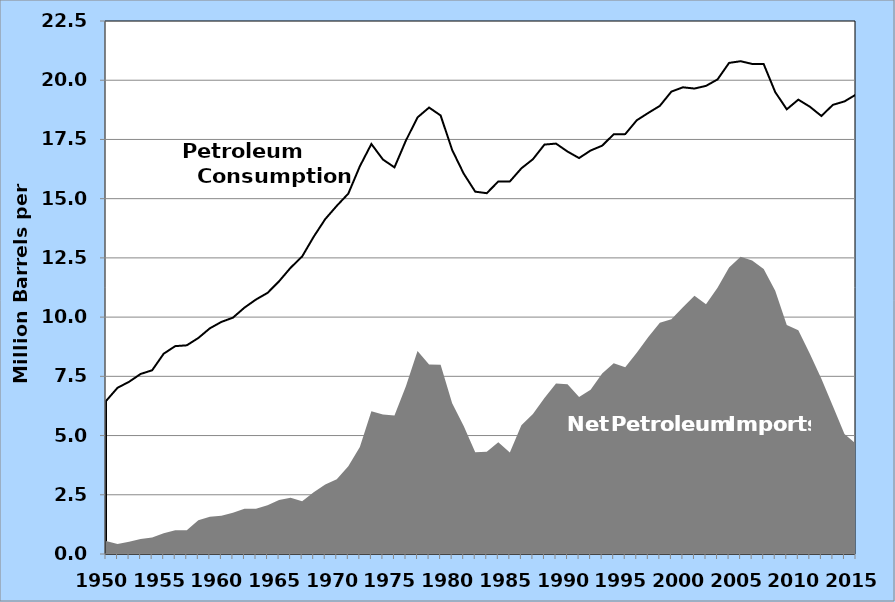
| Category | Petroleum Consumption | Net Imports of Petroleum |
|---|---|---|
| 1950.0 | 6.458 | 0.545 |
| 1951.0 | 7.016 | 0.422 |
| 1952.0 | 7.27 | 0.52 |
| 1953.0 | 7.6 | 0.633 |
| 1954.0 | 7.756 | 0.696 |
| 1955.0 | 8.455 | 0.88 |
| 1956.0 | 8.775 | 1.006 |
| 1957.0 | 8.809 | 1.007 |
| 1958.0 | 9.118 | 1.425 |
| 1959.0 | 9.527 | 1.569 |
| 1960.0 | 9.797 | 1.613 |
| 1961.0 | 9.976 | 1.743 |
| 1962.0 | 10.4 | 1.913 |
| 1963.0 | 10.743 | 1.915 |
| 1964.0 | 11.023 | 2.057 |
| 1965.0 | 11.512 | 2.281 |
| 1966.0 | 12.084 | 2.375 |
| 1967.0 | 12.56 | 2.23 |
| 1968.0 | 13.393 | 2.609 |
| 1969.0 | 14.137 | 2.933 |
| 1970.0 | 14.697 | 3.161 |
| 1971.0 | 15.212 | 3.701 |
| 1972.0 | 16.367 | 4.519 |
| 1973.0 | 17.308 | 6.025 |
| 1974.0 | 16.653 | 5.892 |
| 1975.0 | 16.322 | 5.846 |
| 1976.0 | 17.461 | 7.09 |
| 1977.0 | 18.431 | 8.565 |
| 1978.0 | 18.847 | 8.002 |
| 1979.0 | 18.513 | 7.985 |
| 1980.0 | 17.056 | 6.365 |
| 1981.0 | 16.058 | 5.401 |
| 1982.0 | 15.296 | 4.298 |
| 1983.0 | 15.231 | 4.312 |
| 1984.0 | 15.726 | 4.715 |
| 1985.0 | 15.726 | 4.286 |
| 1986.0 | 16.281 | 5.439 |
| 1987.0 | 16.665 | 5.914 |
| 1988.0 | 17.283 | 6.587 |
| 1989.0 | 17.325 | 7.202 |
| 1990.0 | 16.988 | 7.161 |
| 1991.0 | 16.714 | 6.626 |
| 1992.0 | 17.033 | 6.938 |
| 1993.0 | 17.237 | 7.618 |
| 1994.0 | 17.718 | 8.054 |
| 1995.0 | 17.725 | 7.886 |
| 1996.0 | 18.309 | 8.498 |
| 1997.0 | 18.62 | 9.158 |
| 1998.0 | 18.917 | 9.764 |
| 1999.0 | 19.519 | 9.912 |
| 2000.0 | 19.701 | 10.419 |
| 2001.0 | 19.649 | 10.9 |
| 2002.0 | 19.761 | 10.546 |
| 2003.0 | 20.034 | 11.238 |
| 2004.0 | 20.731 | 12.097 |
| 2005.0 | 20.802 | 12.549 |
| 2006.0 | 20.687 | 12.39 |
| 2007.0 | 20.68 | 12.036 |
| 2008.0 | 19.498 | 11.114 |
| 2009.0 | 18.771 | 9.667 |
| 2010.0 | 19.18 | 9.441 |
| 2011.0 | 18.882 | 8.45 |
| 2012.0 | 18.49 | 7.393 |
| 2013.0 | 18.961 | 6.237 |
| 2014.0 | 19.106 | 5.065 |
| 2015.0 | 19.395 | 4.651 |